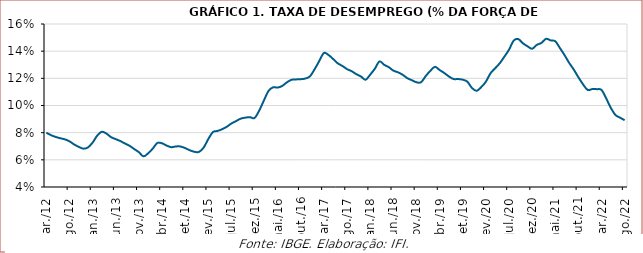
| Category | Taxa de desemprego |
|---|---|
| 2012-03-01 | 0.08 |
| 2012-04-01 | 0.078 |
| 2012-05-01 | 0.077 |
| 2012-06-01 | 0.076 |
| 2012-07-01 | 0.075 |
| 2012-08-01 | 0.074 |
| 2012-09-01 | 0.071 |
| 2012-10-01 | 0.07 |
| 2012-11-01 | 0.068 |
| 2012-12-01 | 0.069 |
| 2013-01-01 | 0.073 |
| 2013-02-01 | 0.078 |
| 2013-03-01 | 0.081 |
| 2013-04-01 | 0.079 |
| 2013-05-01 | 0.077 |
| 2013-06-01 | 0.075 |
| 2013-07-01 | 0.074 |
| 2013-08-01 | 0.072 |
| 2013-09-01 | 0.07 |
| 2013-10-01 | 0.068 |
| 2013-11-01 | 0.066 |
| 2013-12-01 | 0.063 |
| 2014-01-01 | 0.065 |
| 2014-02-01 | 0.068 |
| 2014-03-01 | 0.072 |
| 2014-04-01 | 0.072 |
| 2014-05-01 | 0.071 |
| 2014-06-01 | 0.069 |
| 2014-07-01 | 0.07 |
| 2014-08-01 | 0.07 |
| 2014-09-01 | 0.069 |
| 2014-10-01 | 0.067 |
| 2014-11-01 | 0.066 |
| 2014-12-01 | 0.066 |
| 2015-01-01 | 0.069 |
| 2015-02-01 | 0.075 |
| 2015-03-01 | 0.08 |
| 2015-04-01 | 0.081 |
| 2015-05-01 | 0.083 |
| 2015-06-01 | 0.084 |
| 2015-07-01 | 0.087 |
| 2015-08-01 | 0.089 |
| 2015-09-01 | 0.09 |
| 2015-10-01 | 0.091 |
| 2015-11-01 | 0.091 |
| 2015-12-01 | 0.091 |
| 2016-01-01 | 0.096 |
| 2016-02-01 | 0.103 |
| 2016-03-01 | 0.111 |
| 2016-04-01 | 0.113 |
| 2016-05-01 | 0.113 |
| 2016-06-01 | 0.114 |
| 2016-07-01 | 0.117 |
| 2016-08-01 | 0.119 |
| 2016-09-01 | 0.119 |
| 2016-10-01 | 0.119 |
| 2016-11-01 | 0.12 |
| 2016-12-01 | 0.122 |
| 2017-01-01 | 0.127 |
| 2017-02-01 | 0.133 |
| 2017-03-01 | 0.139 |
| 2017-04-01 | 0.137 |
| 2017-05-01 | 0.134 |
| 2017-06-01 | 0.131 |
| 2017-07-01 | 0.129 |
| 2017-08-01 | 0.127 |
| 2017-09-01 | 0.125 |
| 2017-10-01 | 0.123 |
| 2017-11-01 | 0.121 |
| 2017-12-01 | 0.119 |
| 2018-01-01 | 0.123 |
| 2018-02-01 | 0.127 |
| 2018-03-01 | 0.132 |
| 2018-04-01 | 0.13 |
| 2018-05-01 | 0.128 |
| 2018-06-01 | 0.126 |
| 2018-07-01 | 0.124 |
| 2018-08-01 | 0.123 |
| 2018-09-01 | 0.12 |
| 2018-10-01 | 0.119 |
| 2018-11-01 | 0.117 |
| 2018-12-01 | 0.117 |
| 2019-01-01 | 0.122 |
| 2019-02-01 | 0.126 |
| 2019-03-01 | 0.128 |
| 2019-04-01 | 0.126 |
| 2019-05-01 | 0.124 |
| 2019-06-01 | 0.121 |
| 2019-07-01 | 0.12 |
| 2019-08-01 | 0.119 |
| 2019-09-01 | 0.119 |
| 2019-10-01 | 0.118 |
| 2019-11-01 | 0.113 |
| 2019-12-01 | 0.111 |
| 2020-01-01 | 0.114 |
| 2020-02-01 | 0.118 |
| 2020-03-01 | 0.124 |
| 2020-04-01 | 0.127 |
| 2020-05-01 | 0.131 |
| 2020-06-01 | 0.136 |
| 2020-07-01 | 0.141 |
| 2020-08-01 | 0.148 |
| 2020-09-01 | 0.149 |
| 2020-10-01 | 0.146 |
| 2020-11-01 | 0.144 |
| 2020-12-01 | 0.142 |
| 2021-01-01 | 0.145 |
| 2021-02-01 | 0.146 |
| 2021-03-01 | 0.149 |
| 2021-04-01 | 0.148 |
| 2021-05-01 | 0.147 |
| 2021-06-01 | 0.142 |
| 2021-07-01 | 0.137 |
| 2021-08-01 | 0.131 |
| 2021-09-01 | 0.126 |
| 2021-10-01 | 0.121 |
| 2021-11-01 | 0.116 |
| 2021-12-01 | 0.111 |
| 2022-01-01 | 0.112 |
| 2022-02-01 | 0.112 |
| 2022-03-01 | 0.111 |
| 2022-04-01 | 0.105 |
| 2022-05-01 | 0.098 |
| 2022-06-01 | 0.093 |
| 2022-07-01 | 0.091 |
| 2022-08-01 | 0.089 |